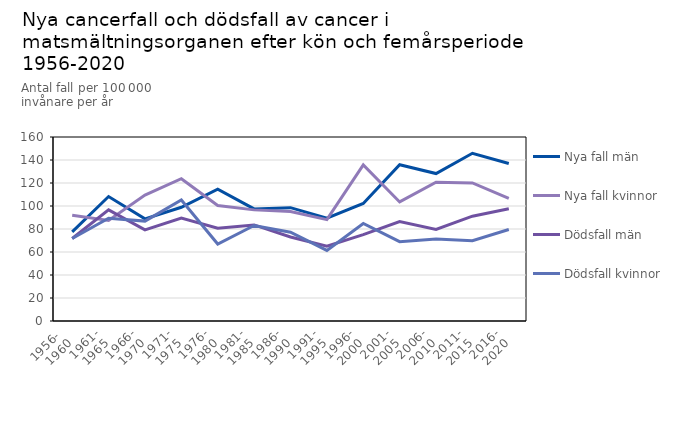
| Category | Nya fall män | Nya fall kvinnor | Dödsfall män | Dödsfall kvinnor |
|---|---|---|---|---|
| 1956- 
1960 | 77.53 | 92.01 | 71.71 | 71.77 |
| 1961-
1965 | 108.23 | 87.47 | 96.63 | 89.33 |
| 1966-
1970 | 88.85 | 109.52 | 79.19 | 86.86 |
| 1971-
1975 | 98.89 | 123.7 | 89.56 | 105.24 |
| 1976-
1980 | 114.69 | 100.44 | 80.64 | 66.96 |
| 1981-
1985 | 97.46 | 96.63 | 83.53 | 83.06 |
| 1986-
1990 | 98.55 | 95.2 | 73.06 | 77.15 |
| 1991-
1995 | 89.44 | 88.18 | 65.05 | 61.41 |
| 1996-
2000 | 102.23 | 135.66 | 75.08 | 84.79 |
| 2001-
2005 | 135.88 | 103.53 | 86.47 | 69.02 |
| 2006-
2010 | 128.2 | 120.65 | 79.57 | 71.23 |
| 2011-
2015 | 145.85 | 120.07 | 91.15 | 69.81 |
| 2016-
2020 | 136.91 | 106.53 | 97.6 | 79.56 |